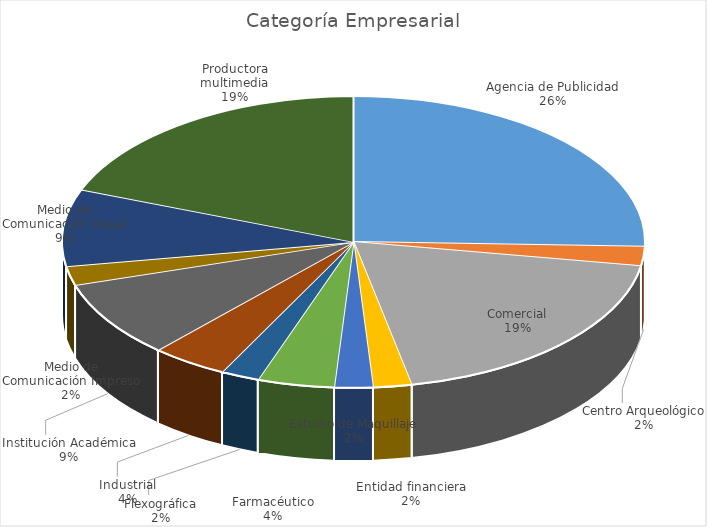
| Category | Total |
|---|---|
| Agencia de Publicidad | 12 |
| Centro Arqueológico | 1 |
| Comercial | 9 |
| Entidad financiera | 1 |
| Estudio de Maquillaje | 1 |
| Farmacéutico | 2 |
| Flexográfica | 1 |
| Industrial | 2 |
| Institución Académica | 4 |
| Medio de Comunicación Impreso | 1 |
| Medio de Comunicación Visual | 4 |
| Productora multimedia | 9 |